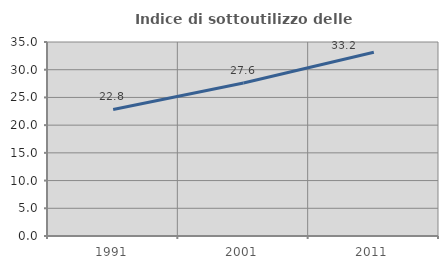
| Category | Indice di sottoutilizzo delle abitazioni  |
|---|---|
| 1991.0 | 22.834 |
| 2001.0 | 27.609 |
| 2011.0 | 33.165 |